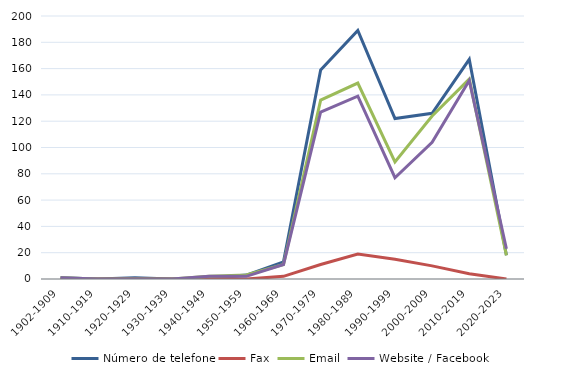
| Category | Número de telefone | Fax | Email | Website / Facebook |
|---|---|---|---|---|
| 1902-1909 | 1 | 0 | 1 | 1 |
| 1910-1919 | 0 | 0 | 0 | 0 |
| 1920-1929 | 1 | 0 | 0 | 0 |
| 1930-1939 | 0 | 0 | 0 | 0 |
| 1940-1949 | 1 | 1 | 2 | 2 |
| 1950-1959 | 3 | 0 | 3 | 2 |
| 1960-1969 | 13 | 2 | 11 | 11 |
| 1970-1979 | 159 | 11 | 136 | 127 |
| 1980-1989 | 189 | 19 | 149 | 139 |
| 1990-1999 | 122 | 15 | 89 | 77 |
| 2000-2009 | 126 | 10 | 124 | 104 |
| 2010-2019 | 167 | 4 | 152 | 151 |
| 2020-2023 | 18 | 0 | 18 | 23 |